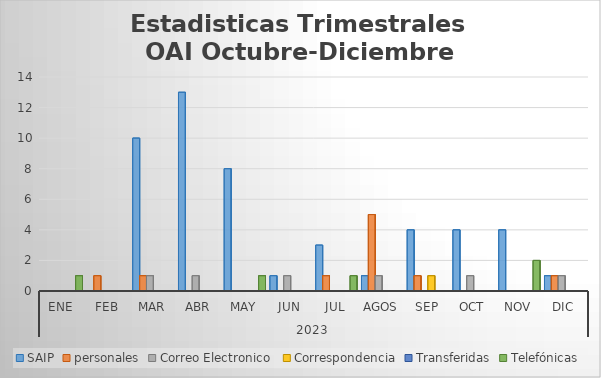
| Category | SAIP | personales | Correo Electronico  | Correspondencia | Transferidas | Telefónicas |
|---|---|---|---|---|---|---|
| 0 | 0 | 0 | 0 | 0 | 0 | 1 |
| 1 | 0 | 1 | 0 | 0 | 0 | 0 |
| 2 | 10 | 1 | 1 | 0 | 0 | 0 |
| 3 | 13 | 0 | 1 | 0 | 0 | 0 |
| 4 | 8 | 0 | 0 | 0 | 0 | 1 |
| 5 | 1 | 0 | 1 | 0 | 0 | 0 |
| 6 | 3 | 1 | 0 | 0 | 0 | 1 |
| 7 | 1 | 5 | 1 | 0 | 0 | 0 |
| 8 | 4 | 1 | 0 | 1 | 0 | 0 |
| 9 | 4 | 0 | 1 | 0 | 0 | 0 |
| 10 | 4 | 0 | 0 | 0 | 0 | 2 |
| 11 | 1 | 1 | 1 | 0 | 0 | 0 |